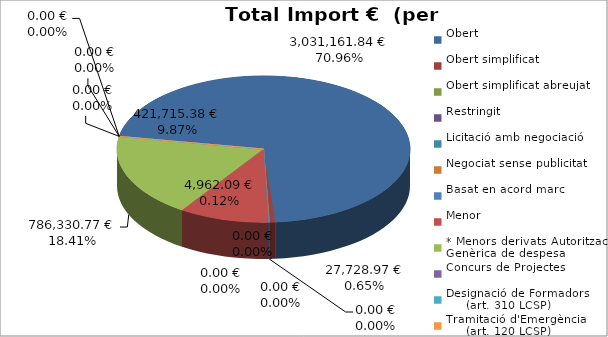
| Category | Total preu
(amb IVA) |
|---|---|
| Obert | 3031161.84 |
| Obert simplificat | 27728.97 |
| Obert simplificat abreujat | 0 |
| Restringit | 0 |
| Licitació amb negociació | 0 |
| Negociat sense publicitat | 0 |
| Basat en acord marc | 4962.09 |
| Menor | 421715.38 |
| * Menors derivats Autorització Genèrica de despesa | 786330.77 |
| Concurs de Projectes | 0 |
| Designació de Formadors
     (art. 310 LCSP) | 0 |
| Tramitació d'Emergència
     (art. 120 LCSP) | 0 |